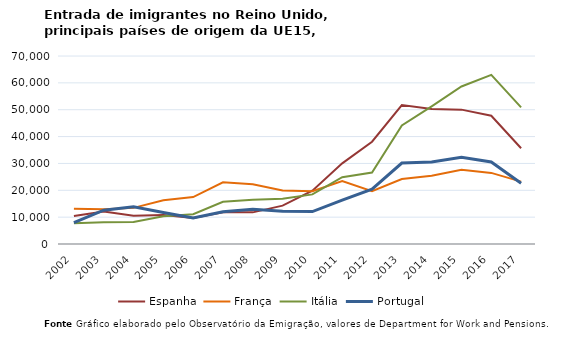
| Category | Espanha | França | Itália | Portugal |
|---|---|---|---|---|
| 2002.0 | 10392 | 13116 | 7709 | 7915 |
| 2003.0 | 12088 | 12899 | 8117 | 12603 |
| 2004.0 | 10478 | 13449 | 8184 | 13867 |
| 2005.0 | 10841 | 16300 | 10358 | 11712 |
| 2006.0 | 9654 | 17456 | 11060 | 9696 |
| 2007.0 | 11836 | 22962 | 15742 | 12039 |
| 2008.0 | 11777 | 22238 | 16462 | 12983 |
| 2009.0 | 14281 | 19895 | 16876 | 12211 |
| 2010.0 | 19858 | 19681 | 18464 | 12064 |
| 2011.0 | 30020 | 23467 | 24891 | 16347 |
| 2012.0 | 38075 | 19624 | 26605 | 20443 |
| 2013.0 | 51729 | 24201 | 44113 | 30121 |
| 2014.0 | 50260 | 25420 | 51217 | 30546 |
| 2015.0 | 50028 | 27618 | 58653 | 32301 |
| 2016.0 | 47741 | 26476 | 62984 | 30543 |
| 2017.0 | 35642 | 23215 | 50880 | 22622 |